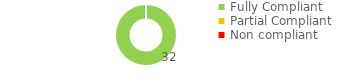
| Category | Series 0 |
|---|---|
| Fully Compliant | 32 |
| Partial Compliant | 0 |
| Non compliant | 0 |